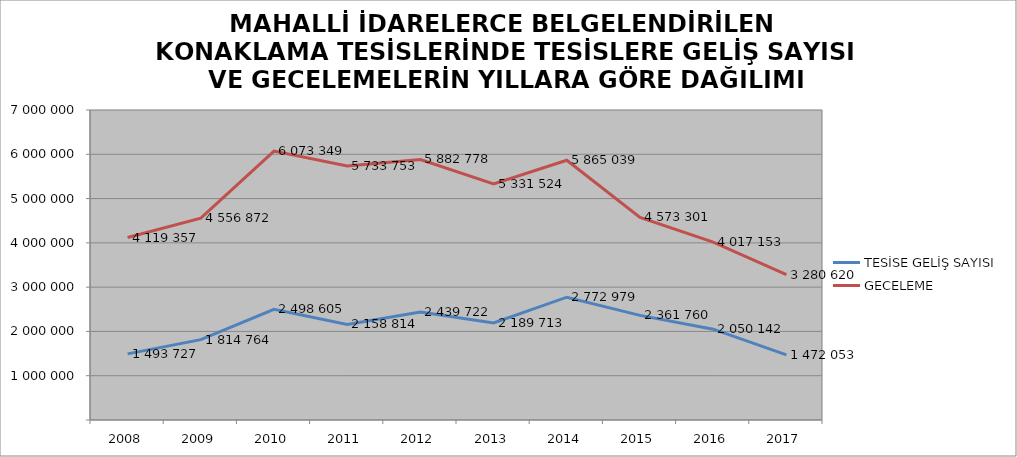
| Category | TESİSE GELİŞ SAYISI | GECELEME |
|---|---|---|
| 2008 | 1493727 | 4119357 |
| 2009 | 1814764 | 4556872 |
| 2010 | 2498605 | 6073349 |
| 2011 | 2158814 | 5733753 |
| 2012 | 2439722 | 5882778 |
| 2013 | 2189713 | 5331524 |
| 2014 | 2772979 | 5865039 |
| 2015 | 2361760 | 4573301 |
| 2016 | 2050142 | 4017153 |
| 2017 | 1472053 | 3280620 |